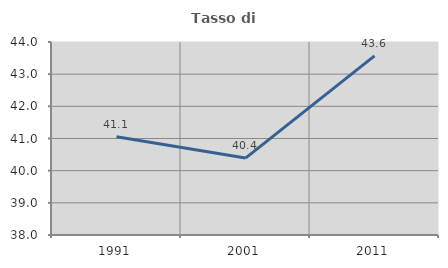
| Category | Tasso di occupazione   |
|---|---|
| 1991.0 | 41.055 |
| 2001.0 | 40.392 |
| 2011.0 | 43.568 |